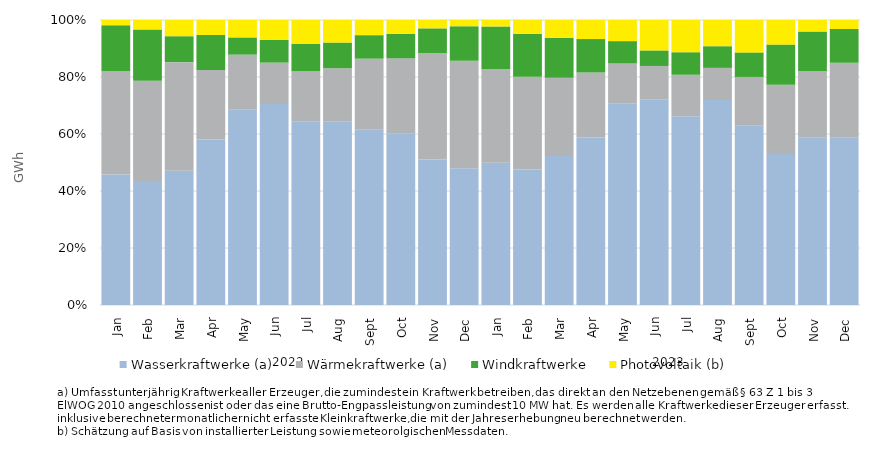
| Category | Wasserkraftwerke (a) | Wärmekraftwerke (a) | Windkraftwerke | Photovoltaik (b) |
|---|---|---|---|---|
| 0 | 3020.147 | 2385.395 | 1066.723 | 121.817 |
| 1 | 2459.61 | 1991.837 | 1019.787 | 187.572 |
| 2 | 2812.698 | 2275.892 | 543.154 | 339.629 |
| 3 | 3479.843 | 1462.957 | 737.313 | 314.893 |
| 4 | 4413.361 | 1226.91 | 388.865 | 392.374 |
| 5 | 4319.403 | 888.698 | 486.555 | 427.779 |
| 6 | 3461.845 | 950.679 | 521.539 | 446.804 |
| 7 | 3196.875 | 923.271 | 447.627 | 391.799 |
| 8 | 3353.432 | 1344.326 | 448.691 | 289.057 |
| 9 | 3294.517 | 1435.142 | 467.176 | 267.447 |
| 10 | 2671.208 | 1950.441 | 456.863 | 153.141 |
| 11 | 2657.927 | 2089.151 | 670.848 | 120.74 |
| 12 | 2817.235 | 1849.132 | 847.188 | 126.36 |
| 13 | 2605.461 | 1784.025 | 827.517 | 262.05 |
| 14 | 3086.504 | 1617.835 | 832.497 | 366.104 |
| 15 | 3576.186 | 1384.791 | 716.094 | 407.056 |
| 16 | 5249.213 | 1038.229 | 582.703 | 549.465 |
| 17 | 4452.208 | 722.811 | 335.826 | 658.791 |
| 18 | 3926.937 | 861.711 | 468.748 | 670.053 |
| 19 | 4620.66 | 725.072 | 489.087 | 590.928 |
| 20 | 3542.273 | 953.712 | 483.552 | 639.199 |
| 21 | 2703.447 | 1239.413 | 718.312 | 440.252 |
| 22 | 3926.712 | 1545.72 | 926.026 | 270.922 |
| 23 | 4000.095 | 1794.57 | 808.395 | 214.928 |